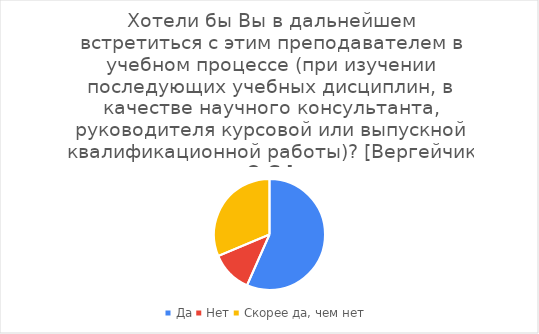
| Category | Series 0 |
|---|---|
| Да | 47 |
| Нет | 10 |
| Скорее да, чем нет | 26 |